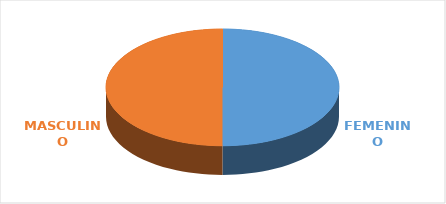
| Category | Series 0 |
|---|---|
| FEMENINO | 2 |
| MASCULINO | 2 |